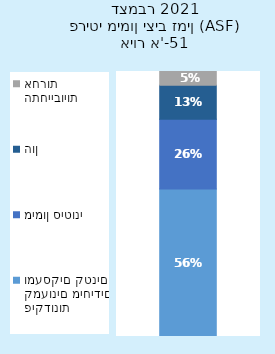
| Category | פיקדונות קמעונים מיחידים ומעסקים קטנים | מימון סיטוני | הון | התחייבויות אחרות |
|---|---|---|---|---|
| 0 | 0.556 | 0.263 | 0.128 | 0.052 |